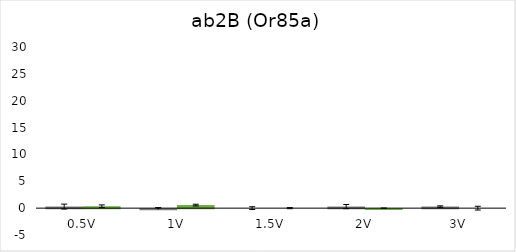
| Category | Series 0 | Series 1 |
|---|---|---|
| 0.5V | 0.29 | 0.36 |
| 1V | -0.21 | 0.57 |
| 1.5V | 0 | 0 |
| 2V | 0.29 | -0.14 |
| 3V | 0.29 | 0 |